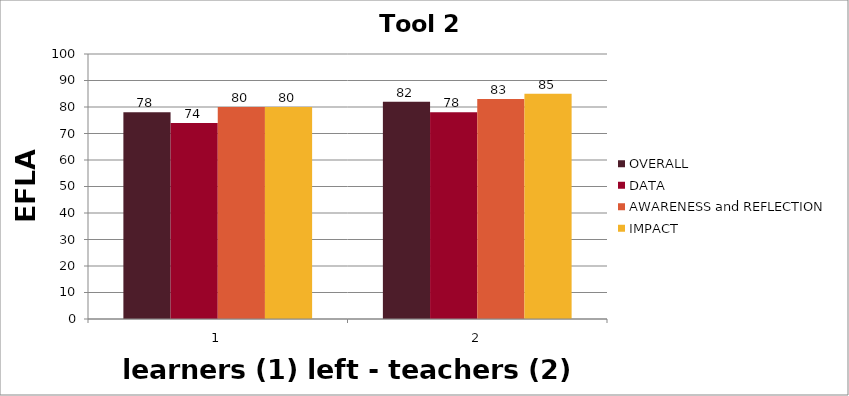
| Category | OVERALL | DATA | AWARENESS and REFLECTION | IMPACT |
|---|---|---|---|---|
| 0 | 78 | 74 | 80 | 80 |
| 1 | 82 | 78 | 83 | 85 |